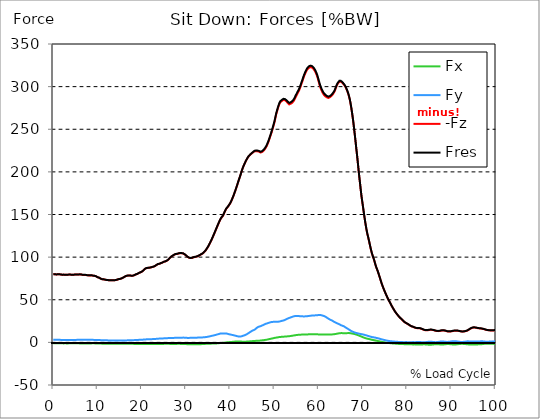
| Category |  Fx |  Fy |  -Fz |  Fres |
|---|---|---|---|---|
| 0.0 | -1.142 | 3.002 | 79.78 | 79.848 |
| 0.167348456675344 | -1.153 | 3.005 | 79.847 | 79.915 |
| 0.334696913350688 | -1.162 | 3.001 | 79.913 | 79.981 |
| 0.5020453700260321 | -1.143 | 2.997 | 79.776 | 79.843 |
| 0.669393826701376 | -1.119 | 2.995 | 79.642 | 79.709 |
| 0.83674228337672 | -1.119 | 2.982 | 79.735 | 79.801 |
| 1.0040907400520642 | -1.126 | 2.975 | 79.859 | 79.925 |
| 1.1621420602454444 | -1.152 | 2.963 | 79.934 | 80 |
| 1.3294905169207885 | -1.16 | 2.949 | 79.882 | 79.948 |
| 1.4968389735961325 | -1.166 | 2.937 | 79.768 | 79.832 |
| 1.6641874302714765 | -1.16 | 2.926 | 79.598 | 79.663 |
| 1.8315358869468206 | -1.156 | 2.919 | 79.447 | 79.512 |
| 1.9988843436221646 | -1.154 | 2.918 | 79.332 | 79.398 |
| 2.1662328002975086 | -1.171 | 2.93 | 79.383 | 79.448 |
| 2.333581256972853 | -1.189 | 2.928 | 79.436 | 79.502 |
| 2.5009297136481967 | -1.169 | 2.923 | 79.271 | 79.337 |
| 2.6682781703235405 | -1.156 | 2.904 | 79.171 | 79.236 |
| 2.8356266269988843 | -1.178 | 2.903 | 79.214 | 79.279 |
| 3.002975083674229 | -1.194 | 2.92 | 79.306 | 79.37 |
| 3.1703235403495724 | -1.194 | 2.918 | 79.346 | 79.412 |
| 3.337671997024917 | -1.179 | 2.914 | 79.382 | 79.447 |
| 3.4957233172182973 | -1.163 | 2.908 | 79.488 | 79.552 |
| 3.663071773893641 | -1.168 | 2.894 | 79.596 | 79.659 |
| 3.8304202305689854 | -1.161 | 2.885 | 79.497 | 79.561 |
| 3.997768687244329 | -1.142 | 2.876 | 79.35 | 79.413 |
| 4.165117143919673 | -1.131 | 2.879 | 79.278 | 79.342 |
| 4.332465600595017 | -1.132 | 2.887 | 79.236 | 79.299 |
| 4.499814057270361 | -1.141 | 2.897 | 79.247 | 79.311 |
| 4.667162513945706 | -1.139 | 2.903 | 79.367 | 79.431 |
| 4.834510970621049 | -1.146 | 2.91 | 79.534 | 79.598 |
| 5.001859427296393 | -1.156 | 2.917 | 79.663 | 79.728 |
| 5.169207883971737 | -1.156 | 2.927 | 79.654 | 79.72 |
| 5.336556340647081 | -1.15 | 2.935 | 79.631 | 79.695 |
| 5.503904797322425 | -1.142 | 2.946 | 79.51 | 79.575 |
| 5.671253253997769 | -1.149 | 2.95 | 79.639 | 79.705 |
| 5.82930457419115 | -1.175 | 2.952 | 79.775 | 79.841 |
| 5.996653030866494 | -1.192 | 2.947 | 79.752 | 79.817 |
| 6.164001487541838 | -1.191 | 2.93 | 79.687 | 79.753 |
| 6.331349944217181 | -1.209 | 2.931 | 79.606 | 79.672 |
| 6.498698400892526 | -1.199 | 2.928 | 79.325 | 79.391 |
| 6.66604685756787 | -1.191 | 2.934 | 79.113 | 79.178 |
| 6.833395314243213 | -1.204 | 2.951 | 79.106 | 79.173 |
| 7.000743770918558 | -1.219 | 2.968 | 79.139 | 79.207 |
| 7.168092227593902 | -1.228 | 2.971 | 79.163 | 79.231 |
| 7.335440684269246 | -1.228 | 2.965 | 79.107 | 79.175 |
| 7.50278914094459 | -1.22 | 2.961 | 78.939 | 79.007 |
| 7.6701375976199335 | -1.202 | 2.955 | 78.725 | 78.792 |
| 7.837486054295278 | -1.191 | 2.951 | 78.577 | 78.644 |
| 7.995537374488658 | -1.196 | 2.948 | 78.54 | 78.607 |
| 8.162885831164003 | -1.199 | 2.944 | 78.516 | 78.583 |
| 8.330234287839346 | -1.187 | 2.938 | 78.542 | 78.609 |
| 8.49758274451469 | -1.18 | 2.935 | 78.57 | 78.637 |
| 8.664931201190035 | -1.176 | 2.933 | 78.599 | 78.665 |
| 8.832279657865378 | -1.17 | 2.939 | 78.495 | 78.561 |
| 8.999628114540721 | -1.144 | 2.936 | 78.247 | 78.313 |
| 9.166976571216066 | -1.155 | 2.923 | 78.057 | 78.123 |
| 9.334325027891412 | -1.177 | 2.916 | 77.993 | 78.058 |
| 9.501673484566755 | -1.204 | 2.917 | 77.817 | 77.884 |
| 9.669021941242098 | -1.208 | 2.919 | 77.456 | 77.524 |
| 9.836370397917442 | -1.285 | 2.859 | 76.826 | 76.893 |
| 10.003718854592787 | -1.313 | 2.807 | 76.369 | 76.436 |
| 10.17106731126813 | -1.325 | 2.775 | 76.189 | 76.255 |
| 10.329118631461512 | -1.327 | 2.765 | 75.907 | 75.973 |
| 10.496467088136853 | -1.365 | 2.704 | 75.387 | 75.453 |
| 10.663815544812199 | -1.428 | 2.621 | 74.813 | 74.879 |
| 10.831164001487544 | -1.482 | 2.545 | 74.327 | 74.393 |
| 10.998512458162887 | -1.497 | 2.505 | 74.102 | 74.167 |
| 11.16586091483823 | -1.516 | 2.497 | 74.07 | 74.136 |
| 11.333209371513574 | -1.523 | 2.48 | 73.966 | 74.032 |
| 11.50055782818892 | -1.532 | 2.469 | 73.79 | 73.857 |
| 11.667906284864264 | -1.546 | 2.448 | 73.566 | 73.632 |
| 11.835254741539607 | -1.563 | 2.411 | 73.365 | 73.431 |
| 12.00260319821495 | -1.581 | 2.378 | 73.219 | 73.283 |
| 12.169951654890292 | -1.6 | 2.346 | 73.09 | 73.155 |
| 12.337300111565641 | -1.607 | 2.34 | 73.008 | 73.073 |
| 12.504648568240984 | -1.614 | 2.32 | 72.925 | 72.989 |
| 12.662699888434362 | -1.62 | 2.283 | 72.838 | 72.901 |
| 12.830048345109708 | -1.627 | 2.245 | 72.794 | 72.858 |
| 12.997396801785053 | -1.634 | 2.208 | 72.765 | 72.828 |
| 13.164745258460396 | -1.633 | 2.2 | 72.742 | 72.805 |
| 13.33209371513574 | -1.626 | 2.189 | 72.738 | 72.8 |
| 13.499442171811083 | -1.619 | 2.177 | 72.74 | 72.801 |
| 13.666790628486426 | -1.623 | 2.171 | 72.795 | 72.857 |
| 13.834139085161771 | -1.637 | 2.171 | 72.889 | 72.951 |
| 14.001487541837117 | -1.661 | 2.179 | 73.004 | 73.068 |
| 14.16883599851246 | -1.67 | 2.163 | 73.185 | 73.248 |
| 14.336184455187803 | -1.669 | 2.148 | 73.409 | 73.471 |
| 14.503532911863147 | -1.661 | 2.136 | 73.673 | 73.736 |
| 14.670881368538492 | -1.66 | 2.152 | 74.005 | 74.068 |
| 14.828932688731873 | -1.683 | 2.139 | 74.232 | 74.296 |
| 14.996281145407215 | -1.696 | 2.13 | 74.376 | 74.439 |
| 15.163629602082558 | -1.697 | 2.133 | 74.539 | 74.604 |
| 15.330978058757903 | -1.708 | 2.139 | 74.832 | 74.897 |
| 15.498326515433247 | -1.705 | 2.157 | 75.186 | 75.249 |
| 15.665674972108594 | -1.704 | 2.171 | 75.596 | 75.66 |
| 15.833023428783937 | -1.691 | 2.186 | 76.098 | 76.161 |
| 16.00037188545928 | -1.67 | 2.202 | 76.627 | 76.691 |
| 16.167720342134626 | -1.669 | 2.229 | 77.186 | 77.249 |
| 16.335068798809967 | -1.687 | 2.269 | 77.631 | 77.696 |
| 16.502417255485312 | -1.671 | 2.308 | 77.99 | 78.056 |
| 16.669765712160658 | -1.679 | 2.343 | 78.225 | 78.292 |
| 16.837114168836 | -1.668 | 2.356 | 78.295 | 78.361 |
| 17.004462625511344 | -1.645 | 2.376 | 78.313 | 78.38 |
| 17.16251394570472 | -1.646 | 2.431 | 78.433 | 78.502 |
| 17.32986240238007 | -1.663 | 2.478 | 78.5 | 78.571 |
| 17.497210859055414 | -1.689 | 2.52 | 78.266 | 78.339 |
| 17.664559315730756 | -1.721 | 2.557 | 78.048 | 78.123 |
| 17.8319077724061 | -1.741 | 2.577 | 78.103 | 78.179 |
| 17.999256229081443 | -1.754 | 2.599 | 78.249 | 78.326 |
| 18.166604685756788 | -1.753 | 2.618 | 78.521 | 78.599 |
| 18.333953142432133 | -1.782 | 2.641 | 78.881 | 78.959 |
| 18.501301599107478 | -1.81 | 2.684 | 79.305 | 79.384 |
| 18.668650055782823 | -1.828 | 2.755 | 79.737 | 79.82 |
| 18.835998512458165 | -1.821 | 2.768 | 79.956 | 80.039 |
| 19.00334696913351 | -1.82 | 2.813 | 80.318 | 80.402 |
| 19.170695425808855 | -1.841 | 2.883 | 80.876 | 80.962 |
| 19.338043882484197 | -1.864 | 2.959 | 81.428 | 81.517 |
| 19.496095202677576 | -1.878 | 3.019 | 81.791 | 81.881 |
| 19.66344365935292 | -1.879 | 3.024 | 82.086 | 82.177 |
| 19.830792116028263 | -1.895 | 3.059 | 82.436 | 82.528 |
| 19.998140572703612 | -1.917 | 3.101 | 82.855 | 82.948 |
| 20.165489029378953 | -1.951 | 3.167 | 83.546 | 83.642 |
| 20.3328374860543 | -1.964 | 3.239 | 84.292 | 84.39 |
| 20.500185942729644 | -1.971 | 3.325 | 85.202 | 85.303 |
| 20.667534399404985 | -1.978 | 3.403 | 86.023 | 86.126 |
| 20.83488285608033 | -1.986 | 3.476 | 86.632 | 86.737 |
| 21.002231312755672 | -1.963 | 3.528 | 87.034 | 87.141 |
| 21.16957976943102 | -1.967 | 3.54 | 87.244 | 87.351 |
| 21.336928226106362 | -1.983 | 3.572 | 87.341 | 87.45 |
| 21.504276682781704 | -2.001 | 3.607 | 87.416 | 87.529 |
| 21.67162513945705 | -1.993 | 3.634 | 87.492 | 87.605 |
| 21.82967645965043 | -1.982 | 3.659 | 87.567 | 87.68 |
| 21.997024916325774 | -1.988 | 3.709 | 87.854 | 87.969 |
| 22.16437337300112 | -1.99 | 3.76 | 88.127 | 88.244 |
| 22.33172182967646 | -1.976 | 3.809 | 88.335 | 88.454 |
| 22.499070286351806 | -1.962 | 3.855 | 88.564 | 88.684 |
| 22.666418743027148 | -1.952 | 3.895 | 88.824 | 88.945 |
| 22.833767199702496 | -1.942 | 3.934 | 89.084 | 89.206 |
| 23.00111565637784 | -1.943 | 4.003 | 89.589 | 89.714 |
| 23.168464113053183 | -1.965 | 4.089 | 90.231 | 90.36 |
| 23.335812569728528 | -1.977 | 4.171 | 90.843 | 90.975 |
| 23.50316102640387 | -1.954 | 4.261 | 91.35 | 91.483 |
| 23.670509483079215 | -1.919 | 4.349 | 91.775 | 91.911 |
| 23.83785793975456 | -1.903 | 4.401 | 92.001 | 92.138 |
| 23.995909259947936 | -1.912 | 4.434 | 92.191 | 92.329 |
| 24.163257716623285 | -1.911 | 4.465 | 92.504 | 92.643 |
| 24.330606173298627 | -1.898 | 4.517 | 92.939 | 93.08 |
| 24.49795462997397 | -1.877 | 4.572 | 93.301 | 93.444 |
| 24.665303086649313 | -1.842 | 4.636 | 93.576 | 93.721 |
| 24.83265154332466 | -1.804 | 4.688 | 94.08 | 94.224 |
| 25.0 | -1.762 | 4.717 | 94.553 | 94.695 |
| 25.167348456675345 | -1.728 | 4.754 | 94.826 | 94.969 |
| 25.334696913350694 | -1.663 | 4.826 | 94.923 | 95.069 |
| 25.502045370026035 | -1.634 | 4.891 | 95.348 | 95.496 |
| 25.669393826701377 | -1.62 | 4.929 | 95.832 | 95.98 |
| 25.836742283376722 | -1.598 | 4.959 | 96.348 | 96.495 |
| 26.004090740052067 | -1.616 | 5.014 | 97.085 | 97.231 |
| 26.17143919672741 | -1.719 | 5.108 | 97.946 | 98.099 |
| 26.329490516920792 | -1.815 | 5.151 | 99.028 | 99.182 |
| 26.49683897359613 | -1.86 | 5.184 | 99.904 | 100.061 |
| 26.66418743027148 | -1.89 | 5.214 | 100.572 | 100.728 |
| 26.831535886946828 | -1.898 | 5.24 | 101.168 | 101.324 |
| 26.998884343622166 | -1.878 | 5.252 | 101.738 | 101.894 |
| 27.166232800297514 | -1.855 | 5.266 | 102.342 | 102.497 |
| 27.333581256972852 | -1.844 | 5.278 | 102.859 | 103.013 |
| 27.5009297136482 | -1.845 | 5.286 | 103.266 | 103.42 |
| 27.668278170323543 | -1.867 | 5.287 | 103.569 | 103.723 |
| 27.835626626998888 | -1.851 | 5.3 | 103.68 | 103.837 |
| 28.002975083674233 | -1.765 | 5.305 | 103.761 | 103.917 |
| 28.170323540349575 | -1.712 | 5.34 | 104.07 | 104.227 |
| 28.33767199702492 | -1.705 | 5.387 | 104.359 | 104.519 |
| 28.50502045370026 | -1.725 | 5.418 | 104.54 | 104.702 |
| 28.663071773893645 | -1.768 | 5.459 | 104.623 | 104.788 |
| 28.830420230568986 | -1.8 | 5.493 | 104.619 | 104.786 |
| 28.99776868724433 | -1.817 | 5.524 | 104.561 | 104.73 |
| 29.165117143919673 | -1.833 | 5.555 | 104.498 | 104.669 |
| 29.33246560059502 | -1.827 | 5.585 | 104.28 | 104.453 |
| 29.499814057270367 | -1.872 | 5.585 | 103.87 | 104.046 |
| 29.66716251394571 | -1.908 | 5.556 | 103.341 | 103.516 |
| 29.834510970621054 | -1.946 | 5.534 | 102.604 | 102.78 |
| 30.00185942729639 | -1.997 | 5.462 | 101.875 | 102.049 |
| 30.169207883971744 | -2.064 | 5.359 | 101.114 | 101.287 |
| 30.33655634064708 | -2.145 | 5.203 | 100.325 | 100.494 |
| 30.50390479732243 | -2.176 | 5.205 | 99.714 | 99.885 |
| 30.671253253997772 | -2.176 | 5.245 | 99.3 | 99.476 |
| 30.829304574191156 | -2.171 | 5.282 | 99.006 | 99.185 |
| 30.996653030866494 | -2.203 | 5.328 | 98.892 | 99.075 |
| 31.164001487541842 | -2.241 | 5.368 | 98.823 | 99.011 |
| 31.331349944217187 | -2.294 | 5.41 | 98.968 | 99.16 |
| 31.498698400892525 | -2.311 | 5.477 | 99.385 | 99.582 |
| 31.666046857567874 | -2.321 | 5.513 | 99.782 | 99.981 |
| 31.833395314243212 | -2.322 | 5.513 | 100.044 | 100.242 |
| 32.00074377091856 | -2.288 | 5.464 | 100.139 | 100.334 |
| 32.1680922275939 | -2.271 | 5.451 | 100.282 | 100.476 |
| 32.33544068426925 | -2.27 | 5.471 | 100.469 | 100.663 |
| 32.50278914094459 | -2.26 | 5.542 | 100.793 | 100.992 |
| 32.670137597619934 | -2.244 | 5.616 | 101.154 | 101.356 |
| 32.83748605429528 | -2.201 | 5.645 | 101.559 | 101.762 |
| 33.004834510970625 | -2.162 | 5.68 | 101.98 | 102.184 |
| 33.162885831164004 | -2.146 | 5.734 | 102.452 | 102.658 |
| 33.33023428783935 | -2.13 | 5.744 | 103.051 | 103.259 |
| 33.497582744514695 | -2.051 | 5.788 | 103.537 | 103.746 |
| 33.664931201190036 | -1.954 | 5.816 | 103.962 | 104.172 |
| 33.83227965786538 | -1.911 | 5.897 | 104.667 | 104.882 |
| 33.99962811454073 | -1.868 | 5.979 | 105.373 | 105.592 |
| 34.16697657121607 | -1.821 | 6.063 | 106.217 | 106.442 |
| 34.33432502789141 | -1.773 | 6.143 | 107.172 | 107.401 |
| 34.50167348456676 | -1.738 | 6.222 | 108.383 | 108.618 |
| 34.6690219412421 | -1.711 | 6.332 | 109.62 | 109.859 |
| 34.83637039791744 | -1.684 | 6.489 | 110.924 | 111.17 |
| 35.00371885459279 | -1.654 | 6.677 | 112.417 | 112.673 |
| 35.17106731126814 | -1.63 | 6.865 | 113.929 | 114.194 |
| 35.338415767943474 | -1.586 | 7.068 | 115.587 | 115.861 |
| 35.49646708813686 | -1.54 | 7.276 | 117.304 | 117.585 |
| 35.6638155448122 | -1.496 | 7.483 | 119.109 | 119.399 |
| 35.831164001487544 | -1.451 | 7.687 | 121.039 | 121.335 |
| 35.998512458162885 | -1.391 | 7.88 | 122.968 | 123.27 |
| 36.165860914838234 | -1.35 | 8.059 | 124.981 | 125.287 |
| 36.333209371513576 | -1.316 | 8.236 | 126.97 | 127.281 |
| 36.50055782818892 | -1.279 | 8.433 | 129.033 | 129.349 |
| 36.667906284864266 | -1.244 | 8.686 | 131.106 | 131.431 |
| 36.83525474153961 | -1.219 | 8.978 | 133.151 | 133.487 |
| 37.002603198214956 | -1.174 | 9.236 | 135.251 | 135.596 |
| 37.1699516548903 | -1.086 | 9.459 | 137.295 | 137.646 |
| 37.337300111565646 | -0.999 | 9.673 | 139.291 | 139.65 |
| 37.50464856824098 | -0.935 | 9.994 | 141.251 | 141.621 |
| 37.66269988843437 | -0.829 | 10.229 | 143.22 | 143.599 |
| 37.83004834510971 | -0.758 | 10.417 | 144.87 | 145.257 |
| 37.99739680178505 | -0.677 | 10.469 | 146.195 | 146.581 |
| 38.16474525846039 | -0.621 | 10.412 | 147.23 | 147.608 |
| 38.33209371513574 | -0.555 | 10.342 | 148.387 | 148.757 |
| 38.49944217181109 | -0.451 | 10.32 | 150.138 | 150.502 |
| 38.666790628486424 | -0.334 | 10.373 | 152.18 | 152.545 |
| 38.83413908516178 | -0.226 | 10.485 | 154.13 | 154.495 |
| 39.001487541837115 | -0.12 | 10.486 | 155.87 | 156.229 |
| 39.16883599851246 | -0.014 | 10.373 | 157.193 | 157.54 |
| 39.336184455187805 | 0.091 | 10.131 | 158.242 | 158.571 |
| 39.503532911863154 | 0.195 | 9.889 | 159.291 | 159.603 |
| 39.670881368538495 | 0.258 | 9.636 | 160.51 | 160.806 |
| 39.83822982521384 | 0.299 | 9.379 | 161.81 | 162.091 |
| 39.996281145407224 | 0.343 | 9.214 | 163.194 | 163.465 |
| 40.163629602082565 | 0.414 | 9.057 | 164.956 | 165.217 |
| 40.33097805875791 | 0.518 | 8.86 | 166.951 | 167.2 |
| 40.498326515433256 | 0.626 | 8.671 | 169.025 | 169.261 |
| 40.6656749721086 | 0.708 | 8.469 | 171.118 | 171.342 |
| 40.83302342878393 | 0.817 | 8.235 | 173.425 | 173.636 |
| 41.00037188545929 | 0.885 | 8.008 | 175.875 | 176.074 |
| 41.16772034213463 | 0.964 | 7.786 | 178.299 | 178.487 |
| 41.33506879880997 | 1.016 | 7.598 | 180.808 | 180.984 |
| 41.50241725548531 | 1.058 | 7.392 | 183.479 | 183.642 |
| 41.66976571216066 | 1.087 | 7.106 | 186.21 | 186.36 |
| 41.837114168836 | 1.055 | 6.929 | 188.858 | 188.998 |
| 42.004462625511344 | 1.017 | 6.861 | 191.471 | 191.607 |
| 42.17181108218669 | 0.978 | 6.834 | 194.023 | 194.156 |
| 42.32986240238007 | 0.928 | 6.91 | 196.656 | 196.789 |
| 42.497210859055414 | 0.902 | 7.115 | 199.5 | 199.639 |
| 42.66455931573076 | 0.865 | 7.315 | 202.217 | 202.363 |
| 42.831907772406105 | 0.837 | 7.603 | 204.59 | 204.747 |
| 42.999256229081446 | 0.809 | 7.95 | 206.808 | 206.979 |
| 43.16660468575679 | 0.792 | 8.207 | 208.723 | 208.904 |
| 43.33395314243214 | 0.797 | 8.488 | 210.622 | 210.812 |
| 43.50130159910748 | 0.834 | 8.902 | 212.439 | 212.645 |
| 43.66865005578282 | 0.886 | 9.379 | 214.109 | 214.335 |
| 43.83599851245817 | 0.951 | 9.886 | 215.659 | 215.908 |
| 44.00334696913351 | 1.013 | 10.421 | 217.037 | 217.31 |
| 44.17069542580886 | 1.081 | 10.978 | 218.221 | 218.52 |
| 44.3380438824842 | 1.145 | 11.555 | 219.205 | 219.535 |
| 44.49609520267758 | 1.218 | 12.128 | 220.041 | 220.403 |
| 44.66344365935292 | 1.31 | 12.703 | 220.818 | 221.214 |
| 44.83079211602827 | 1.395 | 13.247 | 221.58 | 222.012 |
| 44.99814057270361 | 1.476 | 13.732 | 222.276 | 222.739 |
| 45.16548902937895 | 1.551 | 14.144 | 222.89 | 223.38 |
| 45.332837486054295 | 1.621 | 14.465 | 223.744 | 224.253 |
| 45.500185942729644 | 1.692 | 14.893 | 224.326 | 224.86 |
| 45.66753439940499 | 1.738 | 15.421 | 224.439 | 225.007 |
| 45.83488285608033 | 1.803 | 16.246 | 224.337 | 224.98 |
| 46.00223131275568 | 1.868 | 17.082 | 224.227 | 224.948 |
| 46.16957976943102 | 1.927 | 17.669 | 224.171 | 224.956 |
| 46.336928226106366 | 1.988 | 18.217 | 224.065 | 224.911 |
| 46.50427668278171 | 2.059 | 18.564 | 223.675 | 224.558 |
| 46.671625139457056 | 2.036 | 18.649 | 222.895 | 223.789 |
| 46.829676459650436 | 2.146 | 19.006 | 222.717 | 223.64 |
| 46.99702491632577 | 2.269 | 19.372 | 222.892 | 223.847 |
| 47.16437337300112 | 2.369 | 19.724 | 223.24 | 224.227 |
| 47.33172182967646 | 2.461 | 20.09 | 223.847 | 224.864 |
| 47.49907028635181 | 2.568 | 20.504 | 224.666 | 225.718 |
| 47.66641874302716 | 2.697 | 20.984 | 225.635 | 226.728 |
| 47.83376719970249 | 2.828 | 21.443 | 226.707 | 227.84 |
| 48.001115656377834 | 2.952 | 21.771 | 227.996 | 229.153 |
| 48.16846411305319 | 3.099 | 22.049 | 229.613 | 230.787 |
| 48.33581256972853 | 3.251 | 22.288 | 231.377 | 232.565 |
| 48.50316102640387 | 3.429 | 22.521 | 233.458 | 234.656 |
| 48.67050948307921 | 3.641 | 22.834 | 235.729 | 236.947 |
| 48.837857939754564 | 3.857 | 23.15 | 238.326 | 239.562 |
| 49.005206396429905 | 4.052 | 23.461 | 240.862 | 242.117 |
| 49.163257716623285 | 4.218 | 23.589 | 243.398 | 244.65 |
| 49.33060617329863 | 4.427 | 23.865 | 246.146 | 247.415 |
| 49.49795462997397 | 4.62 | 23.993 | 249.003 | 250.27 |
| 49.66530308664932 | 4.814 | 24.049 | 251.966 | 253.221 |
| 49.832651543324666 | 5.031 | 24.162 | 255.133 | 256.385 |
| 50.0 | 5.236 | 24.22 | 258.339 | 259.583 |
| 50.16734845667534 | 5.392 | 24.163 | 262.236 | 263.461 |
| 50.33469691335069 | 5.539 | 24.096 | 266.344 | 267.549 |
| 50.50204537002604 | 5.706 | 24.111 | 269.675 | 270.872 |
| 50.66939382670139 | 5.834 | 24.125 | 272.705 | 273.892 |
| 50.836742283376715 | 5.979 | 24.208 | 275.598 | 276.783 |
| 51.00409074005207 | 6.161 | 24.404 | 278.186 | 279.382 |
| 51.17143919672741 | 6.252 | 24.516 | 280.394 | 281.59 |
| 51.32949051692079 | 6.351 | 24.722 | 281.805 | 283.014 |
| 51.496838973596134 | 6.465 | 25.011 | 282.673 | 283.903 |
| 51.66418743027148 | 6.558 | 25.259 | 283.172 | 284.42 |
| 51.831535886946824 | 6.62 | 25.439 | 283.701 | 284.963 |
| 51.99888434362217 | 6.684 | 25.643 | 284.38 | 285.657 |
| 52.16623280029752 | 6.74 | 25.916 | 284.55 | 285.851 |
| 52.33358125697285 | 6.785 | 26.22 | 284.174 | 285.506 |
| 52.5009297136482 | 6.868 | 26.703 | 283.546 | 284.925 |
| 52.668278170323546 | 6.953 | 27.194 | 282.795 | 284.225 |
| 52.835626626998895 | 7.019 | 27.58 | 281.814 | 283.29 |
| 53.00297508367424 | 7.085 | 27.964 | 280.834 | 282.355 |
| 53.17032354034958 | 7.159 | 28.32 | 279.85 | 281.42 |
| 53.33767199702492 | 7.238 | 28.654 | 279.171 | 280.787 |
| 53.50502045370027 | 7.341 | 28.948 | 279.633 | 281.282 |
| 53.663071773893655 | 7.483 | 29.286 | 279.952 | 281.641 |
| 53.83042023056899 | 7.634 | 29.613 | 280.276 | 282.004 |
| 53.99776868724433 | 7.795 | 29.925 | 281.111 | 282.874 |
| 54.16511714391967 | 7.953 | 30.236 | 281.977 | 283.774 |
| 54.33246560059503 | 8.07 | 30.521 | 283.125 | 284.949 |
| 54.49981405727037 | 8.204 | 30.753 | 284.556 | 286.4 |
| 54.667162513945705 | 8.364 | 30.896 | 286.454 | 288.306 |
| 54.834510970621054 | 8.512 | 30.999 | 288.223 | 290.075 |
| 55.0018594272964 | 8.648 | 31.066 | 289.882 | 291.732 |
| 55.169207883971744 | 8.779 | 31.137 | 291.671 | 293.519 |
| 55.336556340647086 | 8.847 | 31.027 | 293.305 | 295.128 |
| 55.50390479732243 | 8.893 | 30.84 | 294.79 | 296.581 |
| 55.671253253997776 | 8.955 | 30.752 | 296.952 | 298.721 |
| 55.83860171067312 | 9.028 | 30.735 | 299.257 | 301.011 |
| 55.9966530308665 | 9.074 | 30.675 | 301.782 | 303.517 |
| 56.16400148754184 | 9.115 | 30.597 | 304.252 | 305.964 |
| 56.33134994421718 | 9.162 | 30.533 | 306.744 | 308.437 |
| 56.498698400892536 | 9.208 | 30.506 | 309.454 | 311.132 |
| 56.66604685756788 | 9.244 | 30.42 | 311.827 | 313.482 |
| 56.83339531424321 | 9.258 | 30.498 | 314.038 | 315.689 |
| 57.00074377091856 | 9.282 | 30.553 | 316.017 | 317.662 |
| 57.16809222759391 | 9.288 | 30.589 | 317.883 | 319.523 |
| 57.33544068426925 | 9.285 | 30.63 | 319.444 | 321.08 |
| 57.5027891409446 | 9.352 | 30.797 | 320.638 | 322.286 |
| 57.670137597619934 | 9.401 | 30.953 | 321.606 | 323.266 |
| 57.83748605429528 | 9.466 | 31.046 | 322.34 | 324.007 |
| 58.004834510970625 | 9.554 | 31.124 | 322.754 | 324.431 |
| 58.16288583116401 | 9.606 | 31.256 | 322.927 | 324.618 |
| 58.330234287839346 | 9.638 | 31.381 | 322.768 | 324.472 |
| 58.497582744514695 | 9.617 | 31.459 | 322.35 | 324.066 |
| 58.66493120119004 | 9.582 | 31.586 | 321.599 | 323.328 |
| 58.832279657865385 | 9.534 | 31.581 | 320.591 | 322.325 |
| 58.999628114540734 | 9.496 | 31.607 | 319.366 | 321.105 |
| 59.16697657121607 | 9.478 | 31.591 | 317.907 | 319.653 |
| 59.33432502789142 | 9.483 | 31.736 | 316.127 | 317.897 |
| 59.50167348456676 | 9.476 | 31.731 | 314.166 | 315.946 |
| 59.66902194124211 | 9.418 | 31.785 | 311.797 | 313.593 |
| 59.83637039791745 | 9.361 | 31.929 | 308.827 | 310.65 |
| 60.00371885459278 | 9.342 | 32.189 | 305.564 | 307.428 |
| 60.17106731126813 | 9.298 | 32.335 | 302.43 | 304.324 |
| 60.33841576794349 | 9.182 | 32.162 | 299.667 | 301.555 |
| 60.49646708813685 | 9.139 | 31.958 | 297.375 | 299.253 |
| 60.6638155448122 | 9.128 | 31.736 | 295.262 | 297.131 |
| 60.831164001487544 | 9.141 | 31.505 | 293.381 | 295.24 |
| 60.99851245816289 | 9.151 | 31.243 | 291.788 | 293.63 |
| 61.16586091483824 | 9.149 | 30.927 | 290.485 | 292.303 |
| 61.333209371513576 | 9.157 | 30.626 | 289.512 | 291.304 |
| 61.50055782818892 | 9.16 | 30.253 | 288.695 | 290.451 |
| 61.667906284864266 | 9.201 | 29.655 | 288.071 | 289.772 |
| 61.835254741539615 | 9.248 | 29.025 | 287.41 | 289.055 |
| 62.002603198214956 | 9.293 | 28.427 | 286.809 | 288.403 |
| 62.16995165489029 | 9.327 | 27.923 | 286.721 | 288.27 |
| 62.33730011156564 | 9.351 | 27.38 | 286.936 | 288.435 |
| 62.504648568240995 | 9.372 | 26.822 | 287.459 | 288.906 |
| 62.67199702491633 | 9.33 | 26.403 | 288.162 | 289.564 |
| 62.83004834510971 | 9.299 | 26.052 | 288.837 | 290.197 |
| 62.99739680178505 | 9.324 | 25.687 | 289.604 | 290.925 |
| 63.1647452584604 | 9.406 | 25.142 | 290.847 | 292.115 |
| 63.33209371513575 | 9.501 | 24.58 | 292.115 | 293.33 |
| 63.4994421718111 | 9.605 | 24.053 | 293.587 | 294.754 |
| 63.666790628486424 | 9.725 | 23.575 | 295.488 | 296.607 |
| 63.83413908516177 | 9.848 | 23.128 | 297.817 | 298.892 |
| 64.00148754183712 | 10.017 | 22.785 | 300.101 | 301.144 |
| 64.16883599851248 | 10.191 | 22.414 | 302.178 | 303.191 |
| 64.3361844551878 | 10.379 | 21.975 | 303.689 | 304.672 |
| 64.50353291186315 | 10.561 | 21.579 | 304.881 | 305.839 |
| 64.6708813685385 | 10.706 | 21.222 | 305.867 | 306.804 |
| 64.83822982521384 | 10.792 | 20.742 | 306.156 | 307.063 |
| 65.00557828188919 | 10.859 | 20.202 | 305.958 | 306.832 |
| 65.16362960208257 | 10.87 | 19.928 | 305.296 | 306.157 |
| 65.3309780587579 | 10.847 | 19.594 | 304.447 | 305.288 |
| 65.49832651543326 | 10.81 | 19.236 | 303.516 | 304.333 |
| 65.6656749721086 | 10.781 | 18.89 | 302.583 | 303.377 |
| 65.83302342878395 | 10.755 | 18.38 | 301.473 | 302.238 |
| 66.00037188545929 | 10.72 | 17.751 | 300.101 | 300.827 |
| 66.16772034213463 | 10.741 | 17.199 | 298.324 | 299.023 |
| 66.33506879880998 | 10.82 | 16.713 | 296.304 | 296.982 |
| 66.50241725548531 | 10.88 | 16.199 | 294.126 | 294.781 |
| 66.66976571216065 | 10.886 | 15.63 | 291.583 | 292.213 |
| 66.83711416883601 | 10.878 | 15.054 | 288.672 | 289.277 |
| 67.00446262551135 | 10.849 | 14.489 | 285.205 | 285.788 |
| 67.1718110821867 | 10.751 | 13.941 | 280.87 | 281.431 |
| 67.32986240238007 | 10.605 | 13.412 | 275.81 | 276.349 |
| 67.49721085905541 | 10.445 | 12.947 | 270.245 | 270.766 |
| 67.66455931573076 | 10.272 | 12.569 | 264.263 | 264.773 |
| 67.83190777240611 | 10.113 | 12.213 | 257.704 | 258.204 |
| 67.99925622908145 | 9.89 | 11.83 | 250.288 | 250.777 |
| 68.16660468575678 | 9.655 | 11.496 | 242.776 | 243.258 |
| 68.33395314243214 | 9.42 | 11.243 | 235.063 | 235.541 |
| 68.50130159910749 | 9.14 | 10.962 | 226.899 | 227.372 |
| 68.66865005578282 | 8.882 | 10.786 | 219.318 | 219.789 |
| 68.83599851245816 | 8.562 | 10.551 | 210.987 | 211.451 |
| 69.00334696913352 | 8.218 | 10.338 | 202.299 | 202.758 |
| 69.17069542580886 | 7.88 | 10.155 | 194.249 | 194.704 |
| 69.3380438824842 | 7.53 | 9.984 | 186.63 | 187.079 |
| 69.50539233915956 | 7.104 | 9.822 | 178.739 | 179.18 |
| 69.66344365935292 | 6.725 | 9.666 | 171.342 | 171.776 |
| 69.83079211602826 | 6.403 | 9.485 | 165.208 | 165.636 |
| 69.99814057270362 | 6.075 | 9.29 | 159.28 | 159.702 |
| 70.16548902937896 | 5.707 | 9.081 | 152.958 | 153.368 |
| 70.33283748605429 | 5.38 | 8.876 | 147.032 | 147.433 |
| 70.50018594272964 | 5.08 | 8.615 | 141.294 | 141.683 |
| 70.667534399405 | 4.789 | 8.349 | 136.028 | 136.401 |
| 70.83488285608033 | 4.515 | 8.071 | 131.214 | 131.572 |
| 71.00223131275568 | 4.322 | 7.807 | 127.057 | 127.401 |
| 71.16957976943102 | 4.16 | 7.551 | 123.42 | 123.752 |
| 71.33692822610637 | 3.99 | 7.307 | 119.845 | 120.162 |
| 71.50427668278171 | 3.754 | 7.032 | 115.869 | 116.169 |
| 71.67162513945706 | 3.511 | 6.769 | 111.916 | 112.2 |
| 71.8389735961324 | 3.279 | 6.508 | 108.251 | 108.517 |
| 71.99702491632577 | 3.058 | 6.256 | 104.876 | 105.126 |
| 72.16437337300113 | 2.863 | 6.073 | 101.987 | 102.225 |
| 72.33172182967647 | 2.707 | 5.965 | 99.389 | 99.62 |
| 72.49907028635181 | 2.59 | 5.911 | 97.005 | 97.236 |
| 72.66641874302715 | 2.428 | 5.737 | 93.884 | 94.106 |
| 72.8337671997025 | 2.237 | 5.501 | 90.851 | 91.059 |
| 73.00111565637783 | 2.061 | 5.272 | 88.139 | 88.334 |
| 73.16846411305319 | 1.877 | 5.082 | 85.911 | 86.096 |
| 73.33581256972853 | 1.679 | 4.891 | 83.607 | 83.78 |
| 73.50316102640387 | 1.476 | 4.677 | 81.057 | 81.218 |
| 73.67050948307921 | 1.28 | 4.433 | 78.277 | 78.424 |
| 73.83785793975457 | 1.086 | 4.157 | 75.641 | 75.772 |
| 74.00520639642991 | 0.887 | 3.892 | 72.82 | 72.935 |
| 74.16325771662328 | 0.686 | 3.696 | 70.053 | 70.161 |
| 74.33060617329863 | 0.497 | 3.476 | 67.51 | 67.608 |
| 74.49795462997398 | 0.363 | 3.227 | 65.225 | 65.312 |
| 74.66530308664932 | 0.215 | 3.014 | 62.953 | 63.032 |
| 74.83265154332466 | 0.067 | 2.812 | 60.854 | 60.925 |
| 75.00000000000001 | -0.09 | 2.599 | 58.78 | 58.845 |
| 75.16734845667534 | -0.258 | 2.362 | 56.837 | 56.894 |
| 75.3346969133507 | -0.4 | 2.177 | 54.828 | 54.881 |
| 75.50204537002605 | -0.528 | 2.002 | 52.949 | 52.999 |
| 75.66939382670138 | -0.643 | 1.83 | 51.132 | 51.179 |
| 75.83674228337672 | -0.755 | 1.682 | 49.395 | 49.442 |
| 76.00409074005208 | -0.851 | 1.552 | 47.797 | 47.844 |
| 76.17143919672742 | -0.941 | 1.445 | 46.143 | 46.189 |
| 76.33878765340276 | -1.022 | 1.32 | 44.444 | 44.489 |
| 76.49683897359614 | -1.14 | 1.217 | 42.796 | 42.845 |
| 76.66418743027148 | -1.221 | 1.139 | 41.281 | 41.333 |
| 76.83153588694682 | -1.283 | 1.047 | 39.765 | 39.818 |
| 76.99888434362218 | -1.349 | 0.962 | 38.308 | 38.364 |
| 77.16623280029752 | -1.418 | 0.895 | 36.876 | 36.936 |
| 77.33358125697285 | -1.483 | 0.825 | 35.602 | 35.667 |
| 77.5009297136482 | -1.554 | 0.739 | 34.455 | 34.523 |
| 77.66827817032356 | -1.611 | 0.658 | 33.249 | 33.32 |
| 77.83562662699889 | -1.685 | 0.613 | 32.101 | 32.178 |
| 78.00297508367423 | -1.761 | 0.562 | 31.067 | 31.154 |
| 78.17032354034959 | -1.798 | 0.519 | 30.055 | 30.145 |
| 78.33767199702493 | -1.865 | 0.463 | 29.137 | 29.235 |
| 78.50502045370027 | -1.935 | 0.455 | 28.285 | 28.389 |
| 78.67236891037561 | -1.995 | 0.433 | 27.51 | 27.618 |
| 78.83042023056899 | -2.014 | 0.358 | 26.656 | 26.768 |
| 78.99776868724433 | -2.011 | 0.275 | 25.754 | 25.866 |
| 79.16511714391969 | -2.021 | 0.237 | 24.87 | 24.987 |
| 79.33246560059503 | -2.07 | 0.247 | 24.066 | 24.191 |
| 79.49981405727036 | -2.143 | 0.273 | 23.383 | 23.518 |
| 79.66716251394571 | -2.226 | 0.309 | 22.849 | 22.994 |
| 79.83451097062107 | -2.272 | 0.313 | 22.406 | 22.557 |
| 80.00185942729641 | -2.28 | 0.287 | 21.942 | 22.097 |
| 80.16920788397174 | -2.27 | 0.244 | 21.463 | 21.619 |
| 80.33655634064709 | -2.239 | 0.184 | 20.857 | 21.011 |
| 80.50390479732243 | -2.199 | 0.16 | 20.196 | 20.351 |
| 80.67125325399778 | -2.187 | 0.152 | 19.653 | 19.809 |
| 80.83860171067312 | -2.235 | 0.187 | 19.167 | 19.329 |
| 80.99665303086651 | -2.313 | 0.253 | 18.742 | 18.915 |
| 81.16400148754184 | -2.398 | 0.328 | 18.442 | 18.627 |
| 81.3313499442172 | -2.39 | 0.317 | 18.203 | 18.39 |
| 81.49869840089255 | -2.361 | 0.297 | 17.863 | 18.049 |
| 81.66604685756786 | -2.338 | 0.257 | 17.42 | 17.604 |
| 81.83339531424322 | -2.385 | 0.282 | 17.11 | 17.304 |
| 82.00074377091858 | -2.397 | 0.294 | 16.84 | 17.037 |
| 82.16809222759392 | -2.455 | 0.366 | 16.658 | 16.868 |
| 82.33544068426926 | -2.527 | 0.459 | 16.614 | 16.839 |
| 82.50278914094459 | -2.58 | 0.51 | 16.639 | 16.874 |
| 82.67013759761994 | -2.606 | 0.524 | 16.632 | 16.872 |
| 82.83748605429528 | -2.581 | 0.459 | 16.524 | 16.759 |
| 83.00483451097062 | -2.556 | 0.385 | 16.33 | 16.564 |
| 83.17218296764597 | -2.513 | 0.297 | 16.063 | 16.291 |
| 83.33023428783935 | -2.439 | 0.189 | 15.73 | 15.95 |
| 83.4975827445147 | -2.358 | 0.1 | 15.355 | 15.568 |
| 83.66493120119004 | -2.317 | 0.091 | 14.947 | 15.161 |
| 83.83227965786537 | -2.306 | 0.103 | 14.59 | 14.808 |
| 83.99962811454073 | -2.335 | 0.155 | 14.354 | 14.581 |
| 84.16697657121607 | -2.394 | 0.239 | 14.202 | 14.443 |
| 84.33432502789142 | -2.466 | 0.347 | 14.119 | 14.377 |
| 84.50167348456677 | -2.536 | 0.469 | 14.126 | 14.402 |
| 84.6690219412421 | -2.611 | 0.586 | 14.221 | 14.514 |
| 84.83637039791745 | -2.697 | 0.694 | 14.377 | 14.687 |
| 85.0037188545928 | -2.755 | 0.761 | 14.58 | 14.901 |
| 85.17106731126813 | -2.759 | 0.777 | 14.707 | 15.029 |
| 85.33841576794349 | -2.725 | 0.752 | 14.757 | 15.071 |
| 85.50576422461883 | -2.667 | 0.691 | 14.718 | 15.019 |
| 85.66381554481221 | -2.585 | 0.617 | 14.611 | 14.897 |
| 85.83116400148755 | -2.479 | 0.521 | 14.468 | 14.735 |
| 85.99851245816289 | -2.372 | 0.409 | 14.279 | 14.527 |
| 86.16586091483823 | -2.262 | 0.303 | 14.019 | 14.251 |
| 86.33320937151358 | -2.19 | 0.254 | 13.726 | 13.95 |
| 86.50055782818893 | -2.151 | 0.252 | 13.482 | 13.705 |
| 86.66790628486427 | -2.146 | 0.309 | 13.323 | 13.55 |
| 86.83525474153961 | -2.163 | 0.407 | 13.227 | 13.463 |
| 87.00260319821496 | -2.214 | 0.524 | 13.191 | 13.439 |
| 87.16995165489031 | -2.276 | 0.648 | 13.219 | 13.482 |
| 87.33730011156564 | -2.357 | 0.782 | 13.322 | 13.603 |
| 87.504648568241 | -2.452 | 0.923 | 13.506 | 13.808 |
| 87.67199702491634 | -2.539 | 1.037 | 13.729 | 14.049 |
| 87.83004834510972 | -2.531 | 1.058 | 13.886 | 14.204 |
| 87.99739680178506 | -2.508 | 1.046 | 13.971 | 14.285 |
| 88.1647452584604 | -2.464 | 0.996 | 13.971 | 14.276 |
| 88.33209371513574 | -2.383 | 0.899 | 13.898 | 14.187 |
| 88.49944217181108 | -2.281 | 0.782 | 13.762 | 14.034 |
| 88.66679062848644 | -2.177 | 0.666 | 13.553 | 13.809 |
| 88.83413908516178 | -2.084 | 0.587 | 13.259 | 13.502 |
| 89.00148754183712 | -2.007 | 0.532 | 12.998 | 13.232 |
| 89.16883599851246 | -1.989 | 0.557 | 12.843 | 13.08 |
| 89.33618445518782 | -1.987 | 0.618 | 12.726 | 12.965 |
| 89.50353291186315 | -2.019 | 0.724 | 12.686 | 12.935 |
| 89.6708813685385 | -2.077 | 0.847 | 12.711 | 12.975 |
| 89.83822982521386 | -2.167 | 0.992 | 12.78 | 13.063 |
| 90.00557828188919 | -2.265 | 1.127 | 12.917 | 13.221 |
| 90.16362960208257 | -2.379 | 1.275 | 13.088 | 13.417 |
| 90.3309780587579 | -2.465 | 1.404 | 13.283 | 13.633 |
| 90.49832651543326 | -2.501 | 1.455 | 13.444 | 13.799 |
| 90.66567497210859 | -2.494 | 1.438 | 13.551 | 13.899 |
| 90.83302342878395 | -2.462 | 1.39 | 13.623 | 13.958 |
| 91.00037188545929 | -2.41 | 1.315 | 13.661 | 13.977 |
| 91.16772034213463 | -2.331 | 1.221 | 13.645 | 13.935 |
| 91.33506879880998 | -2.239 | 1.092 | 13.601 | 13.863 |
| 91.50241725548533 | -2.126 | 0.947 | 13.53 | 13.764 |
| 91.66976571216065 | -2.008 | 0.794 | 13.42 | 13.63 |
| 91.83711416883601 | -1.909 | 0.654 | 13.211 | 13.4 |
| 92.00446262551137 | -1.825 | 0.555 | 12.998 | 13.172 |
| 92.1718110821867 | -1.758 | 0.473 | 12.812 | 12.973 |
| 92.33915953886203 | -1.736 | 0.455 | 12.714 | 12.873 |
| 92.49721085905541 | -1.737 | 0.482 | 12.67 | 12.827 |
| 92.66455931573077 | -1.777 | 0.557 | 12.694 | 12.858 |
| 92.83190777240611 | -1.834 | 0.655 | 12.761 | 12.934 |
| 92.99925622908145 | -1.912 | 0.748 | 12.929 | 13.115 |
| 93.1666046857568 | -2.007 | 0.886 | 13.105 | 13.309 |
| 93.33395314243214 | -2.097 | 0.993 | 13.337 | 13.557 |
| 93.50130159910749 | -2.178 | 1.105 | 13.607 | 13.845 |
| 93.66865005578283 | -2.285 | 1.199 | 14.018 | 14.274 |
| 93.83599851245818 | -2.339 | 1.173 | 14.521 | 14.777 |
| 94.00334696913353 | -2.413 | 1.143 | 15.111 | 15.368 |
| 94.17069542580886 | -2.484 | 1.125 | 15.693 | 15.953 |
| 94.3380438824842 | -2.536 | 1.111 | 16.199 | 16.461 |
| 94.50539233915954 | -2.566 | 1.116 | 16.609 | 16.873 |
| 94.66344365935292 | -2.587 | 1.126 | 16.988 | 17.252 |
| 94.83079211602828 | -2.6 | 1.126 | 17.262 | 17.524 |
| 94.99814057270362 | -2.603 | 1.113 | 17.4 | 17.661 |
| 95.16548902937897 | -2.566 | 1.061 | 17.395 | 17.646 |
| 95.33283748605432 | -2.582 | 1.055 | 17.324 | 17.576 |
| 95.50018594272963 | -2.605 | 1.056 | 17.247 | 17.502 |
| 95.66753439940499 | -2.552 | 1.094 | 17.04 | 17.291 |
| 95.83488285608034 | -2.486 | 1.133 | 16.832 | 17.079 |
| 96.00223131275567 | -2.36 | 1.167 | 16.623 | 16.86 |
| 96.16957976943102 | -2.251 | 1.178 | 16.448 | 16.674 |
| 96.33692822610638 | -2.225 | 1.159 | 16.43 | 16.65 |
| 96.50427668278171 | -2.225 | 1.15 | 16.458 | 16.674 |
| 96.67162513945706 | -2.175 | 1.185 | 16.288 | 16.506 |
| 96.8389735961324 | -2.115 | 1.227 | 16.088 | 16.309 |
| 96.99702491632577 | -2.046 | 1.257 | 15.919 | 16.142 |
| 97.16437337300111 | -1.927 | 1.134 | 15.779 | 15.984 |
| 97.33172182967647 | -1.813 | 1.011 | 15.574 | 15.763 |
| 97.49907028635181 | -1.713 | 0.924 | 15.296 | 15.475 |
| 97.66641874302715 | -1.583 | 0.866 | 15.011 | 15.178 |
| 97.8337671997025 | -1.53 | 0.833 | 14.739 | 14.903 |
| 98.00111565637785 | -1.516 | 0.814 | 14.499 | 14.663 |
| 98.16846411305319 | -1.507 | 0.829 | 14.334 | 14.501 |
| 98.33581256972855 | -1.513 | 0.852 | 14.215 | 14.384 |
| 98.50316102640389 | -1.535 | 0.889 | 14.13 | 14.303 |
| 98.67050948307921 | -1.549 | 0.908 | 14.132 | 14.308 |
| 98.83785793975456 | -1.538 | 0.898 | 14.013 | 14.19 |
| 99.0052063964299 | -1.516 | 0.865 | 13.899 | 14.075 |
| 99.17255485310525 | -1.544 | 0.903 | 13.851 | 14.035 |
| 99.33060617329863 | -1.618 | 0.995 | 13.885 | 14.085 |
| 99.49795462997399 | -1.707 | 1.097 | 13.972 | 14.19 |
| 99.66530308664933 | -1.799 | 1.2 | 14.128 | 14.364 |
| 99.83265154332467 | -1.885 | 1.294 | 14.324 | 14.576 |
| 100.0 | -1.953 | 1.354 | 14.501 | 14.766 |